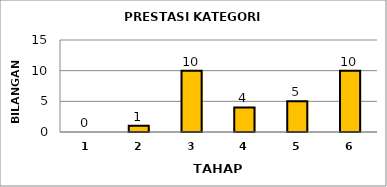
| Category | Series 0 |
|---|---|
| 1.0 | 0 |
| 2.0 | 1 |
| 3.0 | 10 |
| 4.0 | 4 |
| 5.0 | 5 |
| 6.0 | 10 |